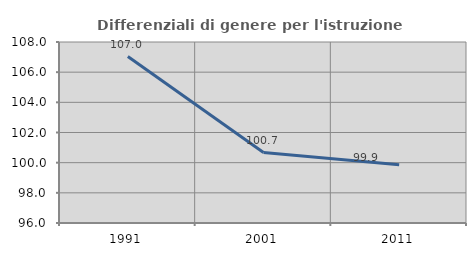
| Category | Differenziali di genere per l'istruzione superiore |
|---|---|
| 1991.0 | 107.034 |
| 2001.0 | 100.672 |
| 2011.0 | 99.866 |